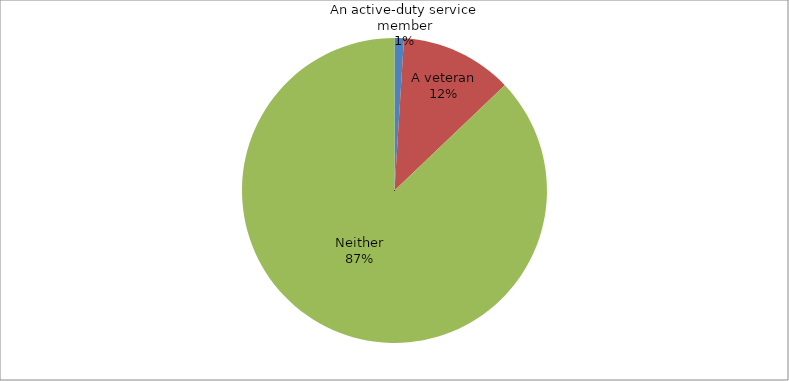
| Category | Series 0 |
|---|---|
| An active-duty service member | 1 |
| A veteran | 12 |
| Neither | 88 |